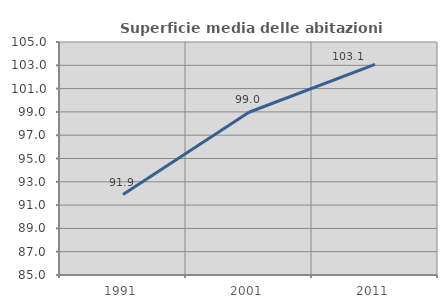
| Category | Superficie media delle abitazioni occupate |
|---|---|
| 1991.0 | 91.905 |
| 2001.0 | 98.971 |
| 2011.0 | 103.084 |